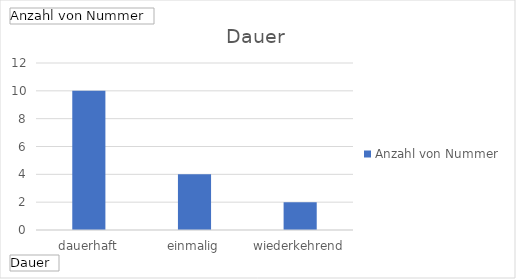
| Category | Ergebnis |
|---|---|
| dauerhaft | 10 |
| einmalig | 4 |
| wiederkehrend | 2 |